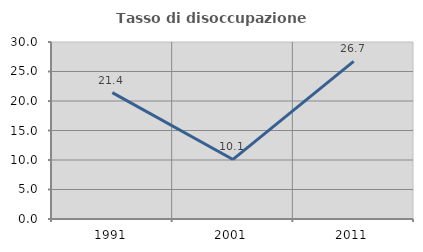
| Category | Tasso di disoccupazione giovanile  |
|---|---|
| 1991.0 | 21.429 |
| 2001.0 | 10.092 |
| 2011.0 | 26.718 |